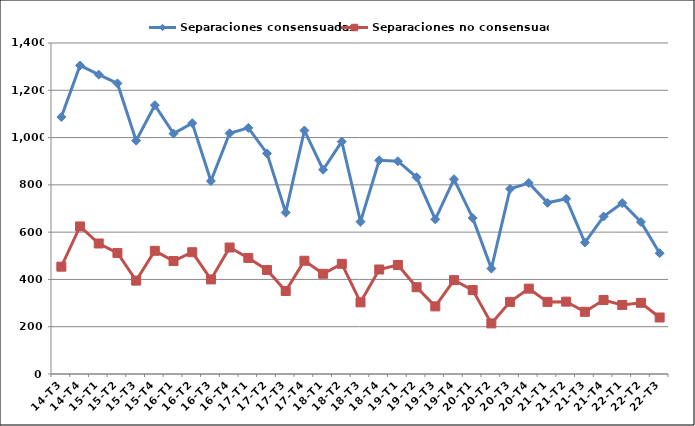
| Category | Separaciones consensuadas | Separaciones no consensuadas |
|---|---|---|
| 14-T3 | 1087 | 454 |
| 14-T4 | 1305 | 624 |
| 15-T1 | 1266 | 552 |
| 15-T2 | 1229 | 512 |
| 15-T3 | 987 | 395 |
| 15-T4 | 1137 | 521 |
| 16-T1 | 1017 | 478 |
| 16-T2 | 1061 | 515 |
| 16-T3 | 816 | 400 |
| 16-T4 | 1018 | 535 |
| 17-T1 | 1041 | 491 |
| 17-T2 | 933 | 440 |
| 17-T3 | 683 | 351 |
| 17-T4 | 1030 | 479 |
| 18-T1 | 864 | 424 |
| 18-T2 | 983 | 466 |
| 18-T3 | 644 | 303 |
| 18-T4 | 904 | 442 |
| 19-T1 | 900 | 461 |
| 19-T2 | 832 | 367 |
| 19-T3 | 654 | 286 |
| 19-T4 | 824 | 397 |
| 20-T1 | 660 | 355 |
| 20-T2 | 446 | 214 |
| 20-T3 | 783 | 305 |
| 20-T4 | 808 | 361 |
| 21-T1 | 724 | 305 |
| 21-T2 | 741 | 306 |
| 21-T3 | 556 | 263 |
| 21-T4 | 666 | 313 |
| 22-T1 | 723 | 292 |
| 22-T2 | 643 | 301 |
| 22-T3 | 511 | 239 |